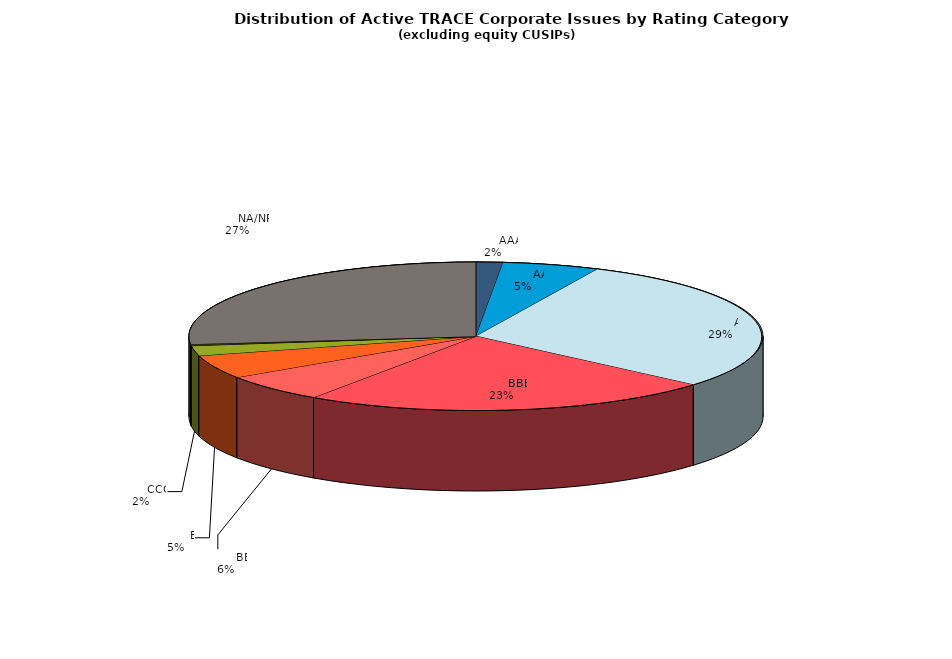
| Category | Series 0 |
|---|---|
|         AAA | 486 |
|         AA | 1764 |
|         A | 9464 |
|         BBB | 7489 |
|         BB | 1965 |
|         B | 1651 |
|         CCC | 699 |
|         CC | 34 |
|         C | 50 |
|         D | 27 |
|         NA/NR | 8604 |